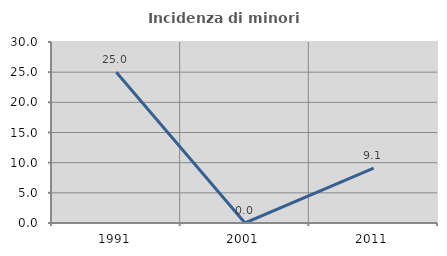
| Category | Incidenza di minori stranieri |
|---|---|
| 1991.0 | 25 |
| 2001.0 | 0 |
| 2011.0 | 9.091 |